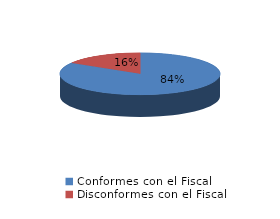
| Category | Series 0 |
|---|---|
| 0 | 31 |
| 1 | 6 |